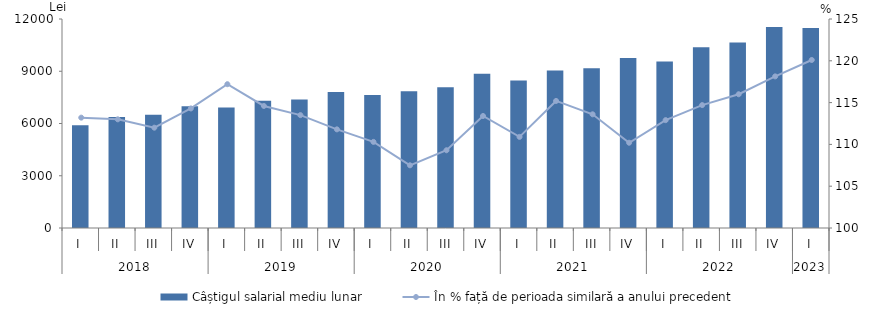
| Category | Câștigul salarial mediu lunar |
|---|---|
| 0 | 5906.5 |
| 1 | 6369.8 |
| 2 | 6507.3 |
| 3 | 6987.5 |
| 4 | 6923 |
| 5 | 7302.6 |
| 6 | 7385 |
| 7 | 7813.1 |
| 8 | 7633.9 |
| 9 | 7849 |
| 10 | 8074.3 |
| 11 | 8859.9 |
| 12 | 8468.6 |
| 13 | 9044.5 |
| 14 | 9175.7 |
| 15 | 9767.6 |
| 16 | 9560.8 |
| 17 | 10376.2 |
| 18 | 10648.1 |
| 19 | 11539.1 |
| 20 | 11486.2 |